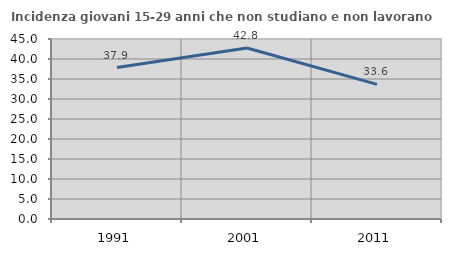
| Category | Incidenza giovani 15-29 anni che non studiano e non lavorano  |
|---|---|
| 1991.0 | 37.861 |
| 2001.0 | 42.76 |
| 2011.0 | 33.648 |